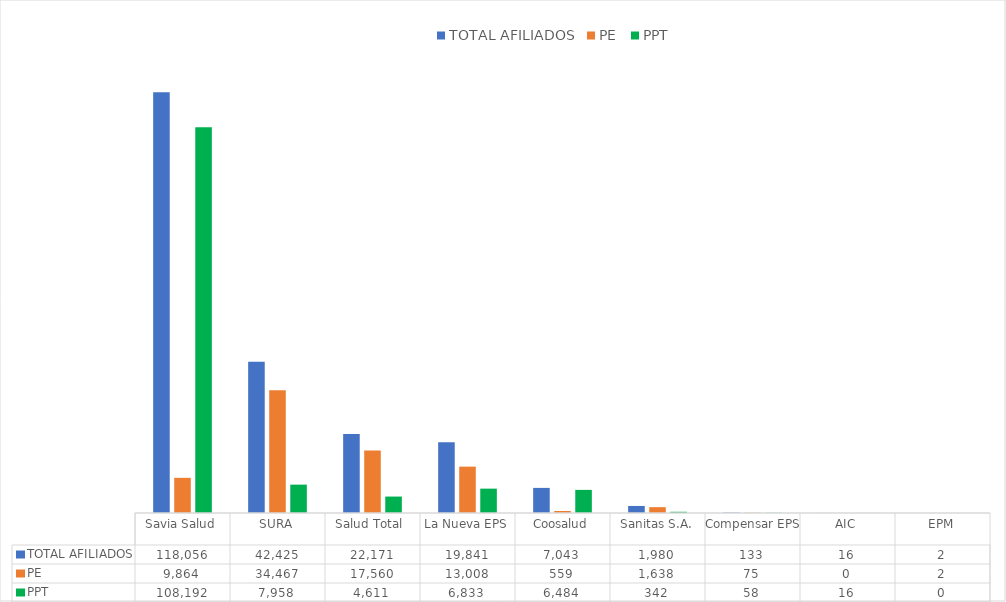
| Category | TOTAL AFILIADOS | PE | PPT |
|---|---|---|---|
| Savia Salud | 118056 | 9864 | 108192 |
| SURA | 42425 | 34467 | 7958 |
| Salud Total  | 22171 | 17560 | 4611 |
| La Nueva EPS | 19841 | 13008 | 6833 |
| Coosalud | 7043 | 559 | 6484 |
| Sanitas S.A. | 1980 | 1638 | 342 |
| Compensar EPS | 133 | 75 | 58 |
| AIC | 16 | 0 | 16 |
| EPM | 2 | 2 | 0 |